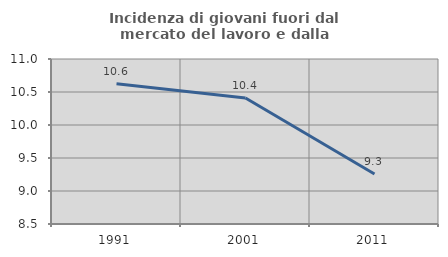
| Category | Incidenza di giovani fuori dal mercato del lavoro e dalla formazione  |
|---|---|
| 1991.0 | 10.624 |
| 2001.0 | 10.41 |
| 2011.0 | 9.259 |